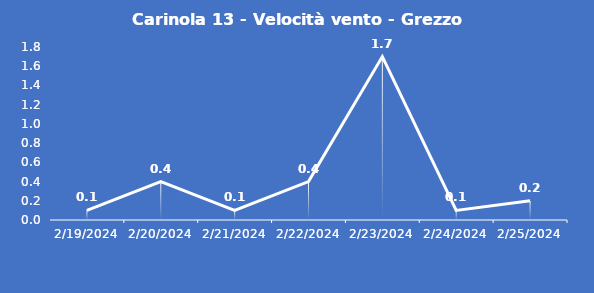
| Category | Carinola 13 - Velocità vento - Grezzo (m/s) |
|---|---|
| 2/19/24 | 0.1 |
| 2/20/24 | 0.4 |
| 2/21/24 | 0.1 |
| 2/22/24 | 0.4 |
| 2/23/24 | 1.7 |
| 2/24/24 | 0.1 |
| 2/25/24 | 0.2 |